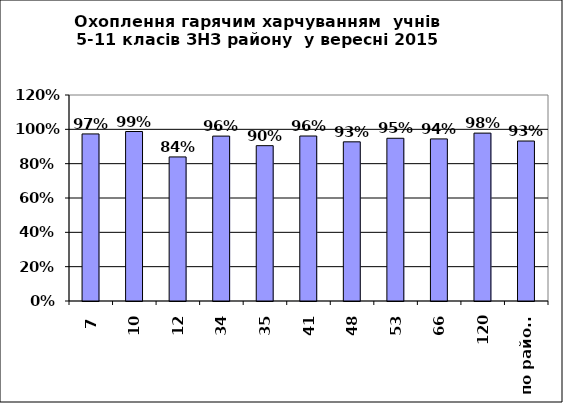
| Category | 97% 99% 84% 96% 90% 96% 93% 95% 94% 98% 93% |
|---|---|
| 7 | 0.973 |
| 10 | 0.987 |
| 12 | 0.839 |
| 34 | 0.961 |
| 35 | 0.905 |
| 41 | 0.961 |
| 48 | 0.927 |
| 53 | 0.948 |
| 66 | 0.944 |
| 120 | 0.978 |
| по району | 0.932 |